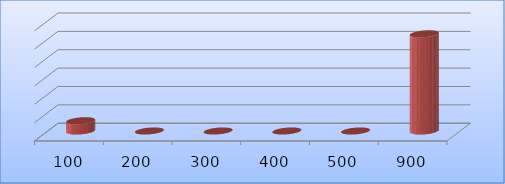
| Category | Series 0 |
|---|---|
| 100.0 | 280000 |
| 200.0 | 0 |
| 300.0 | 0 |
| 400.0 | 0 |
| 500.0 | 0 |
| 900.0 | 2645600 |